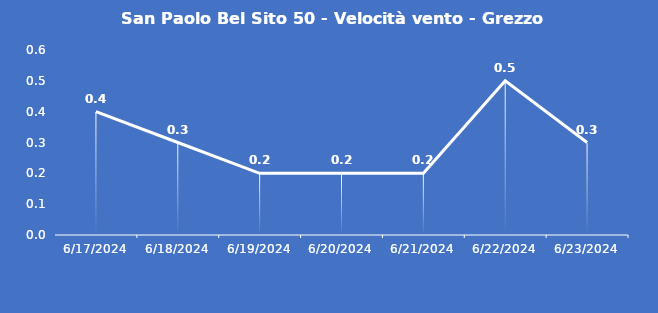
| Category | San Paolo Bel Sito 50 - Velocità vento - Grezzo (m/s) |
|---|---|
| 6/17/24 | 0.4 |
| 6/18/24 | 0.3 |
| 6/19/24 | 0.2 |
| 6/20/24 | 0.2 |
| 6/21/24 | 0.2 |
| 6/22/24 | 0.5 |
| 6/23/24 | 0.3 |